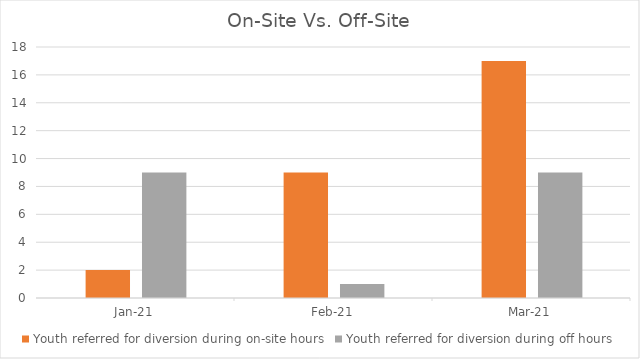
| Category | Youth referred for diversion during on-site hours | Youth referred for diversion during off hours |
|---|---|---|
| 2021-01-01 | 2 | 9 |
| 2021-02-01 | 9 | 1 |
| 2021-03-01 | 17 | 9 |